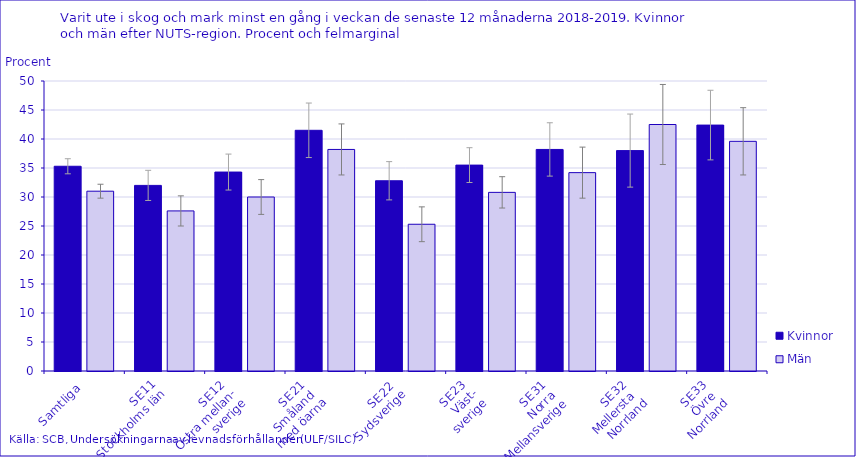
| Category | Kvinnor | Män |
|---|---|---|
| Samtliga | 35.3 | 31 |
| SE11
Stockholms län | 32 | 27.6 |
| SE12 
Östra mellan-
sverige | 34.3 | 30 |
| SE21 
Småland 
med öarna | 41.5 | 38.2 |
| SE22 
Sydsverige | 32.8 | 25.3 |
| SE23 
Väst-
sverige | 35.5 | 30.8 |
| SE31 
Norra 
Mellansverige | 38.2 | 34.2 |
| SE32 
Mellersta 
Norrland | 38 | 42.5 |
| SE33 
Övre 
Norrland | 42.4 | 39.6 |